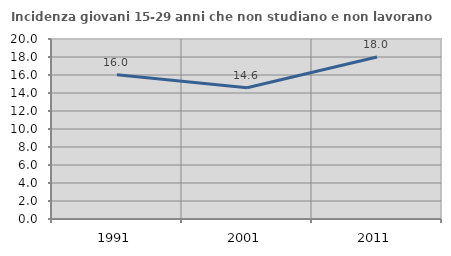
| Category | Incidenza giovani 15-29 anni che non studiano e non lavorano  |
|---|---|
| 1991.0 | 16.034 |
| 2001.0 | 14.583 |
| 2011.0 | 17.994 |